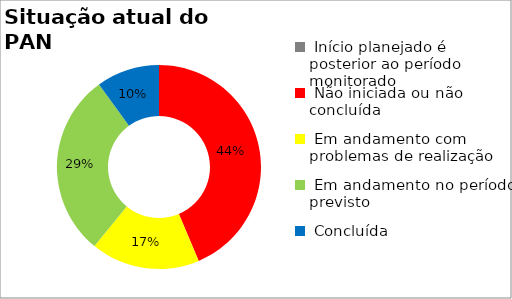
| Category | Series 0 |
|---|---|
|  Início planejado é posterior ao período monitorado | 0 |
|  Não iniciada ou não concluída | 0.436 |
|  Em andamento com problemas de realização | 0.173 |
|  Em andamento no período previsto  | 0.291 |
|  Concluída | 0.1 |